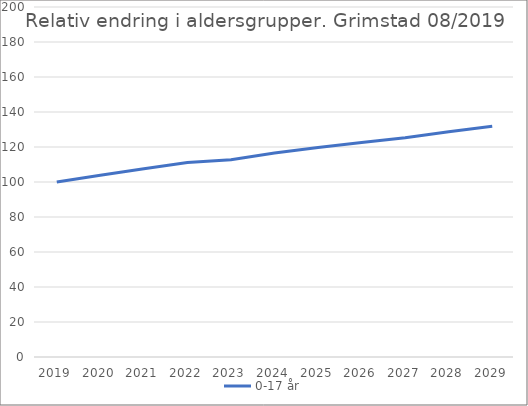
| Category | 0-17 år |
|---|---|
| 2019 | 100 |
| 2020 | 103.842 |
| 2021 | 107.523 |
| 2022 | 111.146 |
| 2023 | 112.768 |
| 2024 | 116.54 |
| 2025 | 119.698 |
| 2026 | 122.586 |
| 2027 | 125.333 |
| 2028 | 128.657 |
| 2029 | 131.839 |